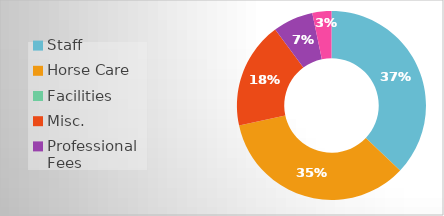
| Category | Series 0 |
|---|---|
| Staff | 17700 |
| Horse Care | 16500 |
| Facilities | 0 |
| Misc. | 8700 |
| Professional Fees | 3290 |
| Insurance | 1560 |